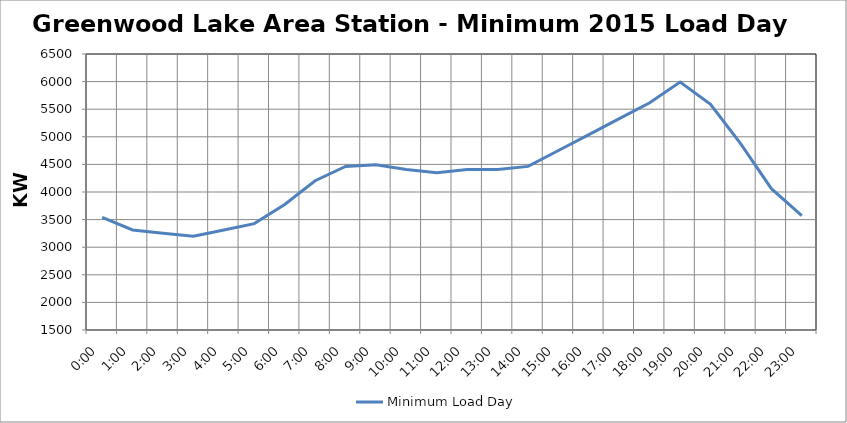
| Category | Minimum Load Day |
|---|---|
| 0.0 | 3542.4 |
| 0.041666666666666664 | 3312 |
| 0.08333333333333333 | 3254.4 |
| 0.125 | 3196.8 |
| 0.16666666666666666 | 3312 |
| 0.20833333333333334 | 3427.2 |
| 0.25 | 3772.8 |
| 0.2916666666666667 | 4204.8 |
| 0.3333333333333333 | 4464 |
| 0.375 | 4492.8 |
| 0.4166666666666667 | 4406.4 |
| 0.4583333333333333 | 4348.8 |
| 0.5 | 4406.4 |
| 0.5416666666666666 | 4406.4 |
| 0.5833333333333334 | 4464 |
| 0.625 | 4752 |
| 0.6666666666666666 | 5040 |
| 0.7083333333333334 | 5328 |
| 0.75 | 5616 |
| 0.7916666666666666 | 5990.4 |
| 0.8333333333333334 | 5587.2 |
| 0.875 | 4867.2 |
| 0.9166666666666666 | 4060.8 |
| 0.9583333333333334 | 3571.2 |